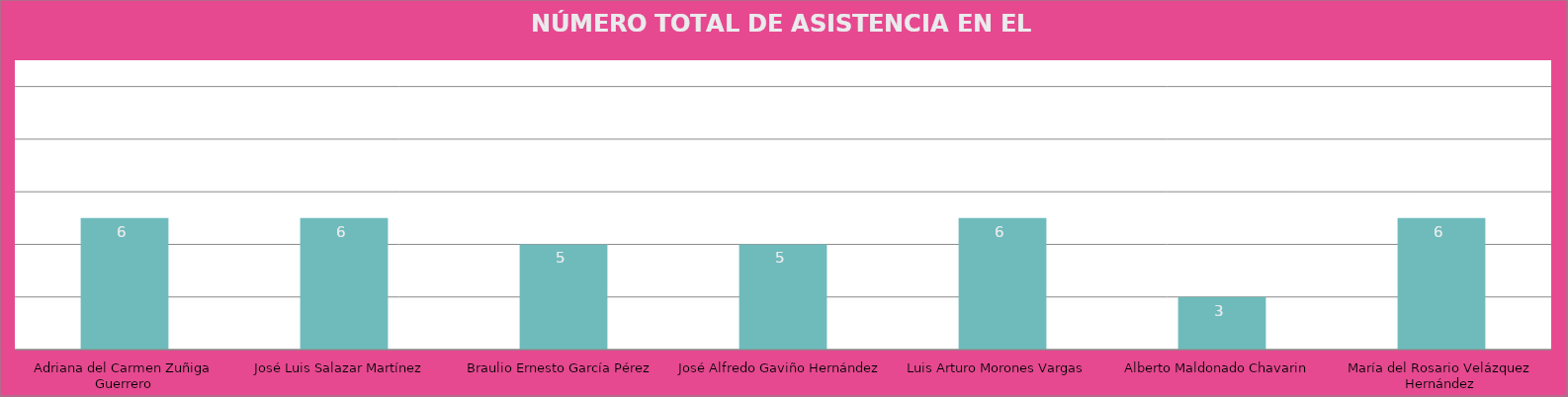
| Category | Adriana del Carmen Zuñiga Guerrero José Luis Salazar Martínez  Braulio Ernesto García Pérez José Alfredo Gaviño Hernández Luis Arturo Morones Vargas  Alberto Maldonado Chavarin  María del Rosario Velázquez Hernández |
|---|---|
| Adriana del Carmen Zuñiga Guerrero | 6 |
| José Luis Salazar Martínez  | 6 |
| Braulio Ernesto García Pérez | 5 |
| José Alfredo Gaviño Hernández | 5 |
| Luis Arturo Morones Vargas  | 6 |
| Alberto Maldonado Chavarin  | 3 |
| María del Rosario Velázquez Hernández | 6 |